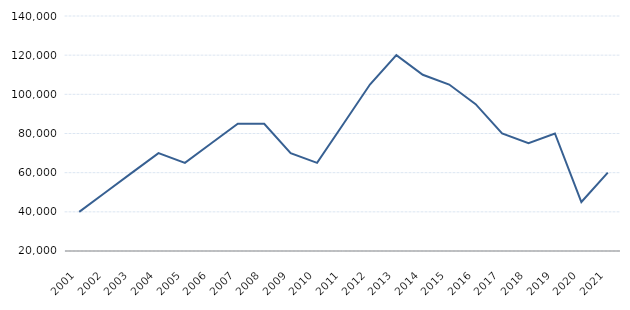
| Category | Series 1 |
|---|---|
| 2001.0 | 40000 |
| 2002.0 | 50000 |
| 2003.0 | 60000 |
| 2004.0 | 70000 |
| 2005.0 | 65000 |
| 2006.0 | 75000 |
| 2007.0 | 85000 |
| 2008.0 | 85000 |
| 2009.0 | 70000 |
| 2010.0 | 65000 |
| 2011.0 | 85000 |
| 2012.0 | 105000 |
| 2013.0 | 120000 |
| 2014.0 | 110000 |
| 2015.0 | 105000 |
| 2016.0 | 95000 |
| 2017.0 | 80000 |
| 2018.0 | 75000 |
| 2019.0 | 80000 |
| 2020.0 | 45000 |
| 2021.0 | 60000 |